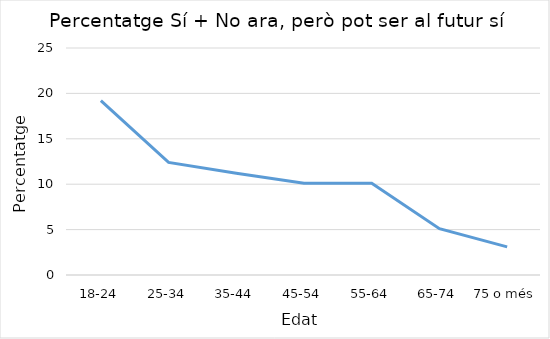
| Category | Series 0 |
|---|---|
| 18-24 | 19.2 |
| 25-34 | 12.4 |
| 35-44 | 11.2 |
| 45-54 | 10.1 |
| 55-64 | 10.1 |
| 65-74 | 5.1 |
| 75 o més | 3.1 |